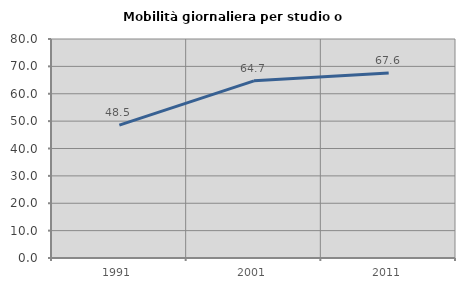
| Category | Mobilità giornaliera per studio o lavoro |
|---|---|
| 1991.0 | 48.529 |
| 2001.0 | 64.706 |
| 2011.0 | 67.613 |